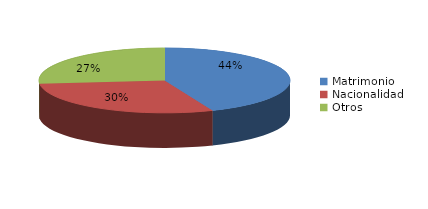
| Category | Series 0 |
|---|---|
| Matrimonio | 1349 |
| Nacionalidad | 911 |
| Otros | 822 |